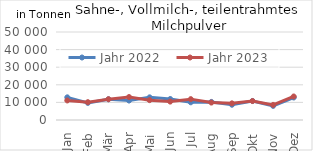
| Category | Jahr 2022 | Jahr 2023 |
|---|---|---|
| Jan | 12874.945 | 11104.103 |
| Feb | 9722.893 | 10131.539 |
| Mär | 11778.275 | 11804.181 |
| Apr | 11055.242 | 13042.949 |
| Mai | 12872.533 | 11279.088 |
| Jun | 11928.252 | 10461.369 |
| Jul | 10061.744 | 11849.433 |
| Aug | 10268.339 | 9909.19 |
| Sep | 8668.728 | 9455.874 |
| Okt | 10812.345 | 10772.838 |
| Nov | 8018.609 | 8577.881 |
| Dez | 12776.499 | 13367.011 |